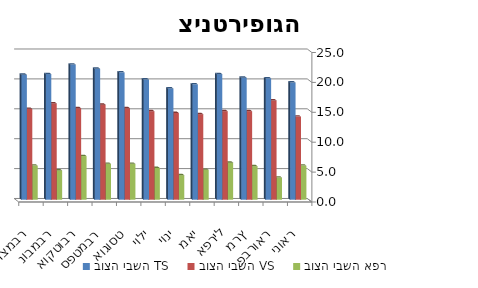
| Category | בוצה יבשה TS | בוצה יבשה VS | בוצה יבשה אפר |
|---|---|---|---|
| ינואר | 19.6 | 13.9 | 5.7 |
| פברואר | 20.3 | 16.6 | 3.7 |
| מרץ | 20.4 | 14.8 | 5.6 |
| אפריל | 21 | 14.8 | 6.2 |
| מאי | 19.3 | 14.3 | 5 |
| יוני | 18.6 | 14.5 | 4.1 |
| יולי | 20.1 | 14.8 | 5.3 |
| אוגוסט | 21.3 | 15.3 | 6 |
| ספטמבר | 21.9 | 15.9 | 6 |
| אוקטובר | 22.6 | 15.3 | 7.3 |
| נובמבר | 21 | 16.1 | 4.9 |
| דצמבר | 20.9 | 15.2 | 5.7 |